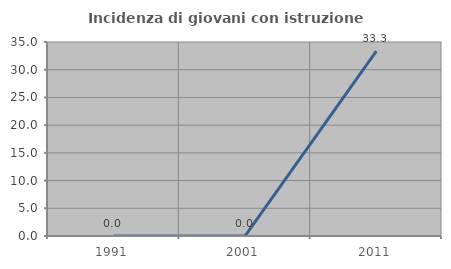
| Category | Incidenza di giovani con istruzione universitaria |
|---|---|
| 1991.0 | 0 |
| 2001.0 | 0 |
| 2011.0 | 33.333 |